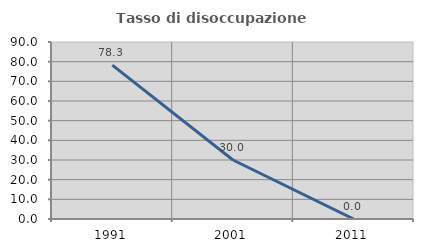
| Category | Tasso di disoccupazione giovanile  |
|---|---|
| 1991.0 | 78.261 |
| 2001.0 | 30 |
| 2011.0 | 0 |